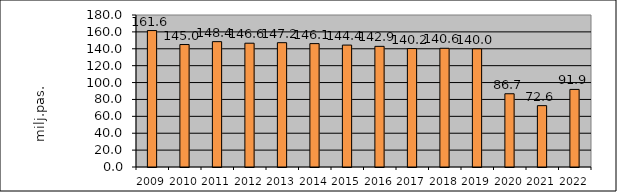
| Category | Series 1 |
|---|---|
| 2009.0 | 161.559 |
| 2010.0 | 145.021 |
| 2011.0 | 148.448 |
| 2012.0 | 146.587 |
| 2013.0 | 147.216 |
| 2014.0 | 146.114 |
| 2015.0 | 144.374 |
| 2016.0 | 142.871 |
| 2017.0 | 140.249 |
| 2018.0 | 140.583 |
| 2019.0 | 139.955 |
| 2020.0 | 86.725 |
| 2021.0 | 72.65 |
| 2022.0 | 91.886 |